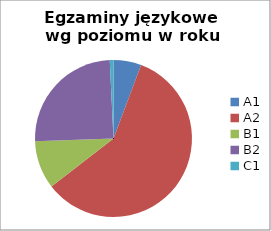
| Category | Series 0 |
|---|---|
| A1 | 15 |
| A2 | 154 |
| B1 | 26 |
| B2 | 65 |
| C1 | 2 |